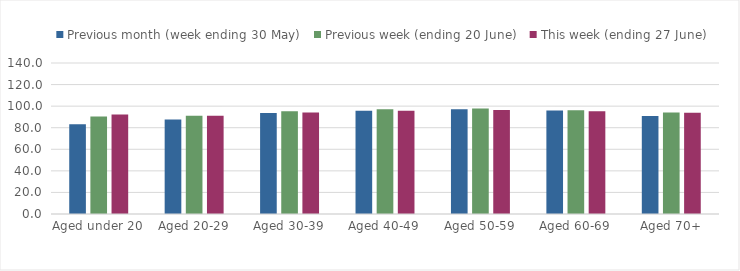
| Category | Previous month (week ending 30 May) | Previous week (ending 20 June) | This week (ending 27 June) |
|---|---|---|---|
| Aged under 20 | 83.232 | 90.314 | 92.179 |
| Aged 20-29 | 87.507 | 91.182 | 91.193 |
| Aged 30-39 | 93.609 | 95.237 | 94.06 |
| Aged 40-49 | 95.786 | 97.055 | 95.793 |
| Aged 50-59 | 97.072 | 97.777 | 96.382 |
| Aged 60-69 | 95.866 | 96.293 | 95.225 |
| Aged 70+ | 90.838 | 94.062 | 93.858 |